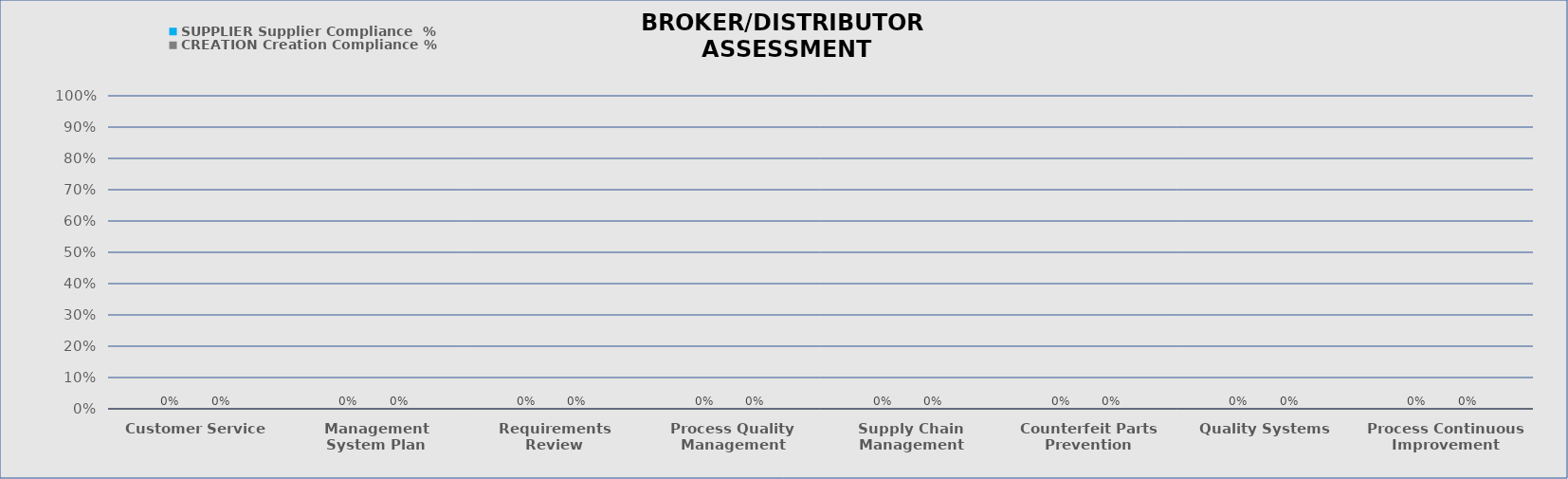
| Category | SUPPLIER | CREATION |
|---|---|---|
| Customer Service | 0 | 0 |
| Management System Plan | 0 | 0 |
| Requirements Review | 0 | 0 |
| Process Quality Management | 0 | 0 |
| Supply Chain Management | 0 | 0 |
| Counterfeit Parts Prevention | 0 | 0 |
| Quality Systems | 0 | 0 |
| Process Continuous Improvement | 0 | 0 |